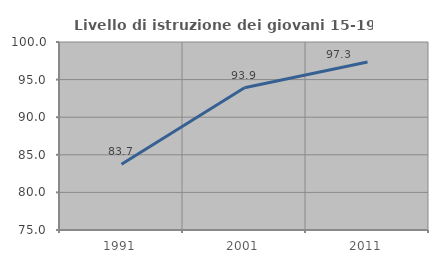
| Category | Livello di istruzione dei giovani 15-19 anni |
|---|---|
| 1991.0 | 83.739 |
| 2001.0 | 93.921 |
| 2011.0 | 97.343 |